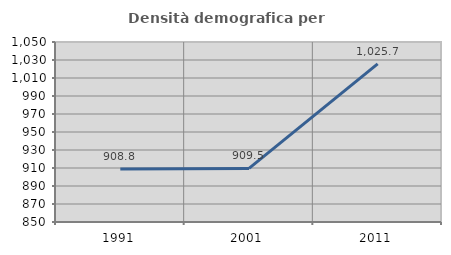
| Category | Densità demografica |
|---|---|
| 1991.0 | 908.765 |
| 2001.0 | 909.507 |
| 2011.0 | 1025.714 |